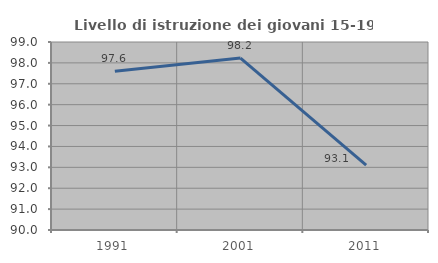
| Category | Livello di istruzione dei giovani 15-19 anni |
|---|---|
| 1991.0 | 97.6 |
| 2001.0 | 98.23 |
| 2011.0 | 93.103 |